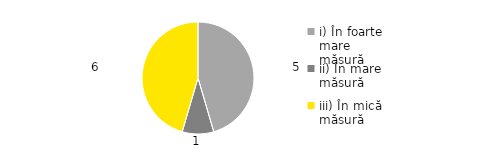
| Category | Total |
|---|---|
| i) În foarte mare măsură | 0.455 |
| ii) În mare măsură | 0.091 |
| iii) În mică măsură | 0.455 |